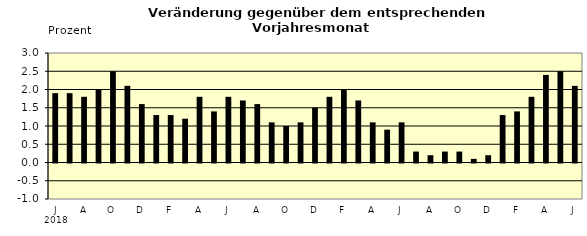
| Category | Series 0 |
|---|---|
| 0 | 1.9 |
| 1 | 1.9 |
| 2 | 1.8 |
| 3 | 2 |
| 4 | 2.5 |
| 5 | 2.1 |
| 6 | 1.6 |
| 7 | 1.3 |
| 8 | 1.3 |
| 9 | 1.2 |
| 10 | 1.8 |
| 11 | 1.4 |
| 12 | 1.8 |
| 13 | 1.7 |
| 14 | 1.6 |
| 15 | 1.1 |
| 16 | 1 |
| 17 | 1.1 |
| 18 | 1.5 |
| 19 | 1.8 |
| 20 | 2 |
| 21 | 1.7 |
| 22 | 1.1 |
| 23 | 0.9 |
| 24 | 1.1 |
| 25 | 0.3 |
| 26 | 0.2 |
| 27 | 0.3 |
| 28 | 0.3 |
| 29 | 0.1 |
| 30 | 0.2 |
| 31 | 1.3 |
| 32 | 1.4 |
| 33 | 1.8 |
| 34 | 2.4 |
| 35 | 2.5 |
| 36 | 2.1 |